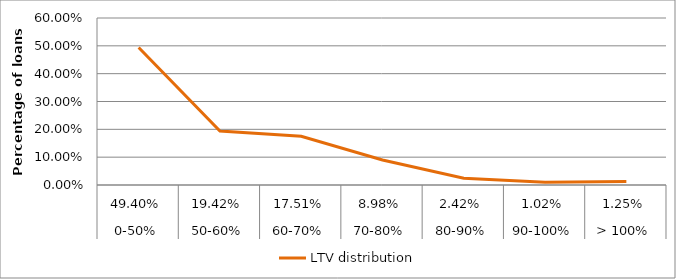
| Category | LTV distribution |
|---|---|
| 0 | 0.494 |
| 1 | 0.194 |
| 2 | 0.175 |
| 3 | 0.09 |
| 4 | 0.024 |
| 5 | 0.01 |
| 6 | 0.012 |